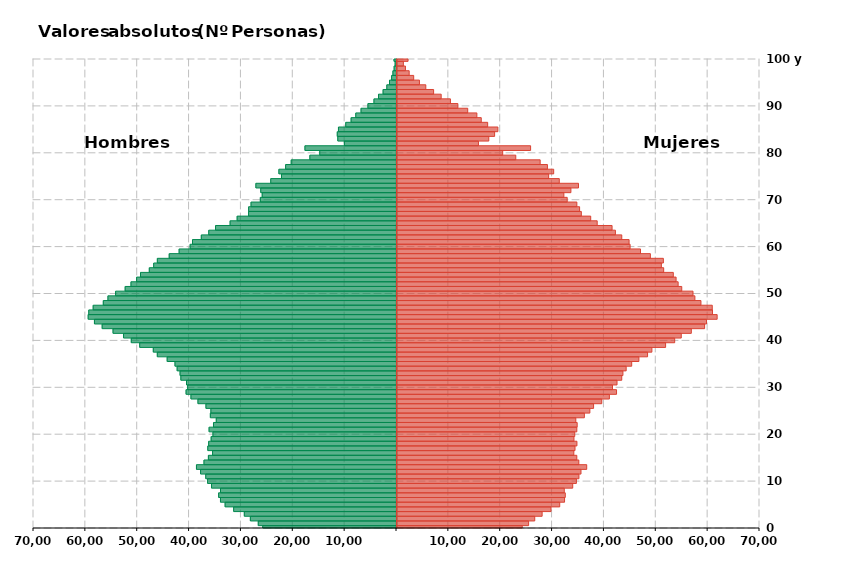
| Category | Hombres | Mujeres |
|---|---|---|
| 0 | -25788 | 24147 |
| 1 | -26654 | 25382 |
| 2 | -28180 | 26563 |
| 3 | -29345 | 27986 |
| 4 | -31397 | 29700 |
| 5 | -33048 | 31379 |
| 6 | -33943 | 32312 |
| 7 | -34299 | 32453 |
| 8 | -33938 | 32258 |
| 9 | -35665 | 33886 |
| 10 | -36426 | 34594 |
| 11 | -36783 | 35082 |
| 12 | -37780 | 35482 |
| 13 | -38574 | 36582 |
| 14 | -37124 | 35063 |
| 15 | -36273 | 34672 |
| 16 | -35467 | 34097 |
| 17 | -36391 | 34327 |
| 18 | -36221 | 34697 |
| 19 | -35740 | 34126 |
| 20 | -35392 | 34274 |
| 21 | -36141 | 34676 |
| 22 | -35292 | 34746 |
| 23 | -34753 | 34480 |
| 24 | -35895 | 36131 |
| 25 | -35791 | 37191 |
| 26 | -36744 | 37910 |
| 27 | -38285 | 39489 |
| 28 | -39637 | 40955 |
| 29 | -40575 | 42334 |
| 30 | -40271 | 41555 |
| 31 | -40495 | 42429 |
| 32 | -41582 | 43339 |
| 33 | -41736 | 43567 |
| 34 | -42298 | 44192 |
| 35 | -42715 | 45257 |
| 36 | -44223 | 46648 |
| 37 | -46125 | 48318 |
| 38 | -46897 | 49150 |
| 39 | -49520 | 51795 |
| 40 | -51144 | 53550 |
| 41 | -52633 | 54815 |
| 42 | -54662 | 56755 |
| 43 | -56757 | 59318 |
| 44 | -58246 | 59691 |
| 45 | -59455 | 61736 |
| 46 | -59340 | 60840 |
| 47 | -58492 | 60793 |
| 48 | -56538 | 58613 |
| 49 | -55641 | 57444 |
| 50 | -54171 | 57081 |
| 51 | -52325 | 54911 |
| 52 | -51200 | 54214 |
| 53 | -50114 | 53819 |
| 54 | -49366 | 53281 |
| 55 | -47669 | 51427 |
| 56 | -46822 | 50979 |
| 57 | -46118 | 51366 |
| 58 | -43829 | 48859 |
| 59 | -41917 | 46958 |
| 60 | -39792 | 44952 |
| 61 | -39336 | 44756 |
| 62 | -37640 | 43345 |
| 63 | -36205 | 42119 |
| 64 | -34892 | 41474 |
| 65 | -32084 | 38606 |
| 66 | -30729 | 37356 |
| 67 | -28525 | 35548 |
| 68 | -28515 | 35211 |
| 69 | -28048 | 34681 |
| 70 | -26259 | 32821 |
| 71 | -25892 | 32178 |
| 72 | -26176 | 33534 |
| 73 | -27114 | 34999 |
| 74 | -24247 | 31294 |
| 75 | -22177 | 29244 |
| 76 | -22677 | 30213 |
| 77 | -21379 | 29007 |
| 78 | -20304 | 27607 |
| 79 | -16705 | 22905 |
| 80 | -14796 | 20383 |
| 81 | -17653 | 25764 |
| 82 | -10054 | 15704 |
| 83 | -11320 | 17700 |
| 84 | -11422 | 18824 |
| 85 | -11192 | 19455 |
| 86 | -9786 | 17482 |
| 87 | -8753 | 16248 |
| 88 | -7850 | 15400 |
| 89 | -6835 | 13635 |
| 90 | -5507 | 11736 |
| 91 | -4344 | 10304 |
| 92 | -3474 | 8520 |
| 93 | -2585 | 7062 |
| 94 | -1864 | 5556 |
| 95 | -1348 | 4328 |
| 96 | -943 | 3219 |
| 97 | -689 | 2348 |
| 98 | -454 | 1630 |
| 99 | -265 | 1227 |
| 100 | -482 | 2133 |